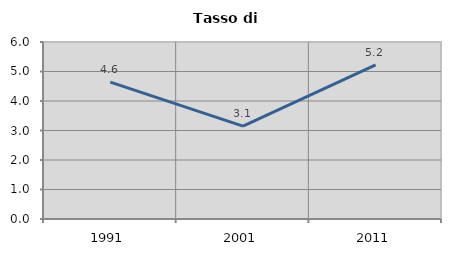
| Category | Tasso di disoccupazione   |
|---|---|
| 1991.0 | 4.64 |
| 2001.0 | 3.148 |
| 2011.0 | 5.225 |